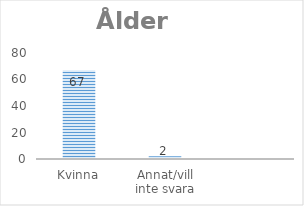
| Category | Series 0 |
|---|---|
| Kvinna | 67 |
| Annat/vill inte svara | 2 |